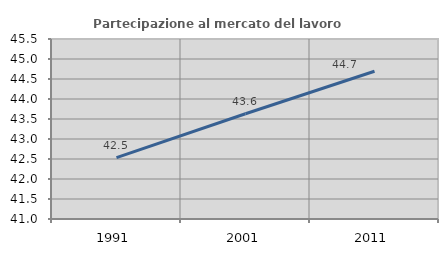
| Category | Partecipazione al mercato del lavoro  femminile |
|---|---|
| 1991.0 | 42.535 |
| 2001.0 | 43.631 |
| 2011.0 | 44.693 |